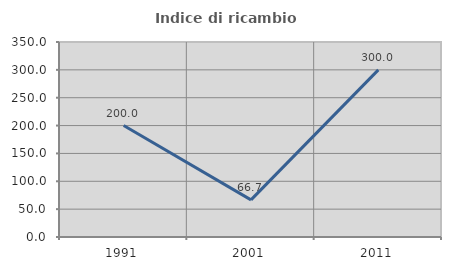
| Category | Indice di ricambio occupazionale  |
|---|---|
| 1991.0 | 200 |
| 2001.0 | 66.667 |
| 2011.0 | 300 |